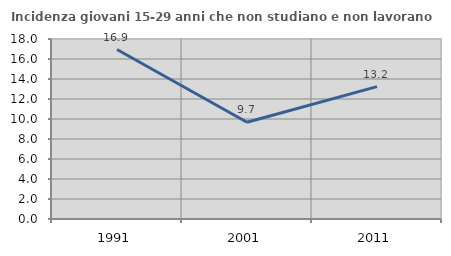
| Category | Incidenza giovani 15-29 anni che non studiano e non lavorano  |
|---|---|
| 1991.0 | 16.944 |
| 2001.0 | 9.67 |
| 2011.0 | 13.236 |